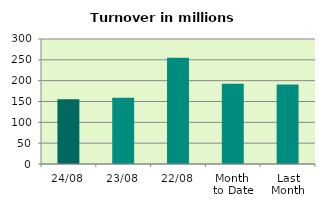
| Category | Series 0 |
|---|---|
| 24/08 | 155.435 |
| 23/08 | 158.75 |
| 22/08 | 254.701 |
| Month 
to Date | 192.498 |
| Last
Month | 191.038 |